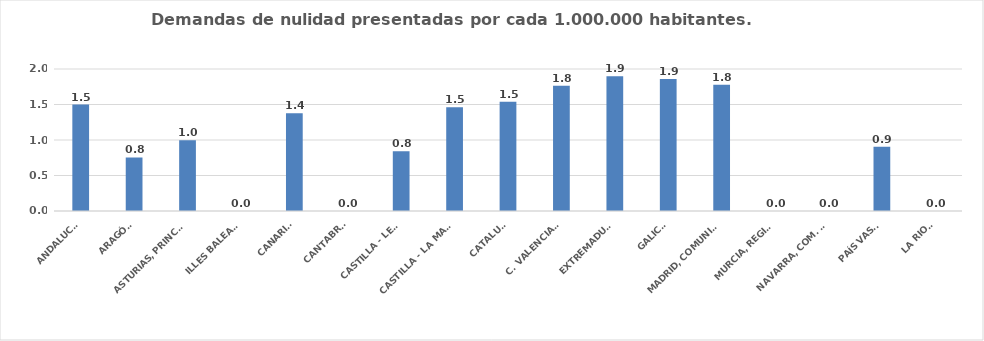
| Category | Series 0 |
|---|---|
| ANDALUCÍA | 1.5 |
| ARAGÓN | 0.754 |
| ASTURIAS, PRINCIPADO | 0.995 |
| ILLES BALEARS | 0 |
| CANARIAS | 1.378 |
| CANTABRIA | 0 |
| CASTILLA - LEÓN | 0.843 |
| CASTILLA - LA MANCHA | 1.461 |
| CATALUÑA | 1.54 |
| C. VALENCIANA | 1.765 |
| EXTREMADURA | 1.896 |
| GALICIA | 1.858 |
| MADRID, COMUNIDAD | 1.778 |
| MURCIA, REGIÓN | 0 |
| NAVARRA, COM. FORAL | 0 |
| PAÍS VASCO | 0.906 |
| LA RIOJA | 0 |